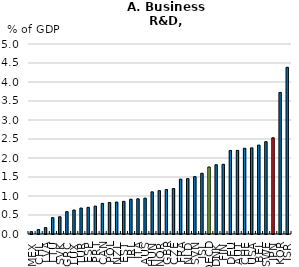
| Category | BERD as a percentage of GDP, 2018 or latest |
|---|---|
| MEX | 0.062 |
| CHL | 0.118 |
| LVA | 0.169 |
| LTU | 0.431 |
| SVK | 0.453 |
| GRC | 0.588 |
| LUX | 0.631 |
| TUR | 0.683 |
| ESP | 0.702 |
| PRT | 0.734 |
| CAN | 0.806 |
| POL | 0.83 |
| NZL | 0.841 |
| EST | 0.859 |
| IRL | 0.915 |
| ITA | 0.926 |
| AUS | 0.943 |
| HUN | 1.11 |
| NOR | 1.141 |
| GBR | 1.17 |
| CZE | 1.197 |
| FRA | 1.445 |
| NLD | 1.457 |
| SVN | 1.511 |
| ISL | 1.598 |
| OECD | 1.764 |
| DNK | 1.822 |
| FIN | 1.835 |
| DEU | 2.199 |
| AUT | 2.201 |
| CHE | 2.256 |
| USA | 2.267 |
| BEL | 2.339 |
| SWE | 2.429 |
| JPN | 2.532 |
| KOR | 3.726 |
| ISR | 4.387 |